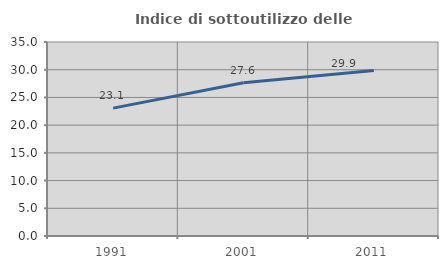
| Category | Indice di sottoutilizzo delle abitazioni  |
|---|---|
| 1991.0 | 23.075 |
| 2001.0 | 27.647 |
| 2011.0 | 29.861 |